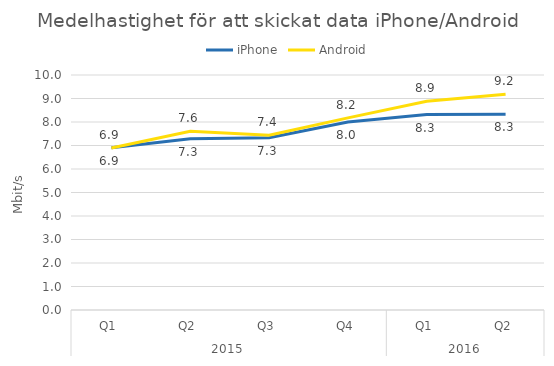
| Category | iPhone | Android |
|---|---|---|
| 0 | 6.908 | 6.892 |
| 1 | 7.287 | 7.607 |
| 2 | 7.328 | 7.439 |
| 3 | 7.998 | 8.175 |
| 4 | 8.317 | 8.881 |
| 5 | 8.332 | 9.179 |